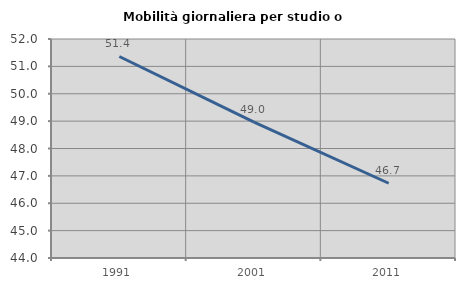
| Category | Mobilità giornaliera per studio o lavoro |
|---|---|
| 1991.0 | 51.362 |
| 2001.0 | 48.967 |
| 2011.0 | 46.731 |